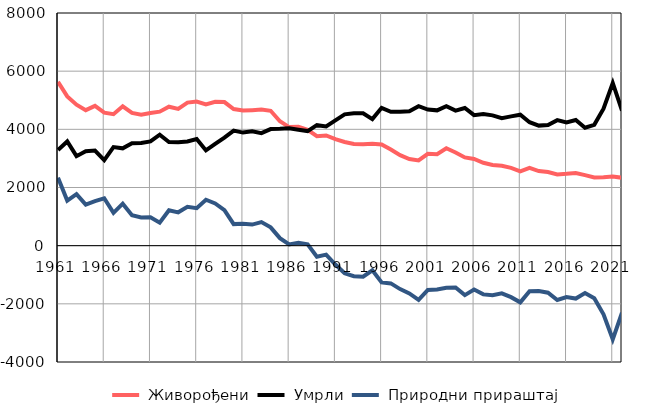
| Category |  Живорођени |  Умрли |  Природни прираштај |
|---|---|---|---|
| 1961.0 | 5631 | 3292 | 2339 |
| 1962.0 | 5132 | 3583 | 1549 |
| 1963.0 | 4847 | 3077 | 1770 |
| 1964.0 | 4659 | 3245 | 1414 |
| 1965.0 | 4806 | 3271 | 1535 |
| 1966.0 | 4575 | 2944 | 1631 |
| 1967.0 | 4521 | 3391 | 1130 |
| 1968.0 | 4791 | 3346 | 1445 |
| 1969.0 | 4565 | 3521 | 1044 |
| 1970.0 | 4499 | 3527 | 972 |
| 1971.0 | 4563 | 3585 | 978 |
| 1972.0 | 4608 | 3816 | 792 |
| 1973.0 | 4778 | 3561 | 1217 |
| 1974.0 | 4705 | 3559 | 1146 |
| 1975.0 | 4918 | 3583 | 1335 |
| 1976.0 | 4956 | 3669 | 1287 |
| 1977.0 | 4856 | 3276 | 1580 |
| 1978.0 | 4948 | 3497 | 1451 |
| 1979.0 | 4937 | 3712 | 1225 |
| 1980.0 | 4698 | 3956 | 742 |
| 1981.0 | 4645 | 3888 | 757 |
| 1982.0 | 4660 | 3935 | 725 |
| 1983.0 | 4681 | 3870 | 811 |
| 1984.0 | 4638 | 4008 | 630 |
| 1985.0 | 4276 | 4017 | 259 |
| 1986.0 | 4077 | 4034 | 43 |
| 1987.0 | 4089 | 3989 | 100 |
| 1988.0 | 3985 | 3940 | 45 |
| 1989.0 | 3762 | 4143 | -381 |
| 1990.0 | 3791 | 4100 | -309 |
| 1991.0 | 3660 | 4310 | -650 |
| 1992.0 | 3564 | 4514 | -950 |
| 1993.0 | 3499 | 4549 | -1050 |
| 1994.0 | 3490 | 4555 | -1065 |
| 1995.0 | 3506 | 4352 | -846 |
| 1996.0 | 3477 | 4740 | -1263 |
| 1997.0 | 3307 | 4605 | -1298 |
| 1998.0 | 3110 | 4603 | -1493 |
| 1999.0 | 2979 | 4621 | -1642 |
| 2000.0 | 2930 | 4795 | -1865 |
| 2001.0 | 3158 | 4681 | -1523 |
| 2002.0 | 3146 | 4653 | -1507 |
| 2003.0 | 3348 | 4794 | -1446 |
| 2004.0 | 3206 | 4644 | -1438 |
| 2005.0 | 3033 | 4734 | -1701 |
| 2006.0 | 2980 | 4486 | -1506 |
| 2007.0 | 2851 | 4526 | -1675 |
| 2008.0 | 2774 | 4481 | -1707 |
| 2009.0 | 2745 | 4384 | -1639 |
| 2010.0 | 2675 | 4446 | -1771 |
| 2011.0 | 2555 | 4504 | -1949 |
| 2012.0 | 2676 | 4246 | -1570 |
| 2013.0 | 2565 | 4128 | -1563 |
| 2014.0 | 2531 | 4148 | -1617 |
| 2015.0 | 2449 | 4317 | -1868 |
| 2016.0 | 2470 | 4237 | -1767 |
| 2017.0 | 2500 | 4319 | -1819 |
| 2018.0 | 2427 | 4057 | -1630 |
| 2019.0 | 2344 | 4154 | -1810 |
| 2020.0 | 2350 | 4712 | -2362 |
| 2021.0 | 2374 | 5594 | -3220 |
| 2022.0 | 2335 | 4642 | -2307 |